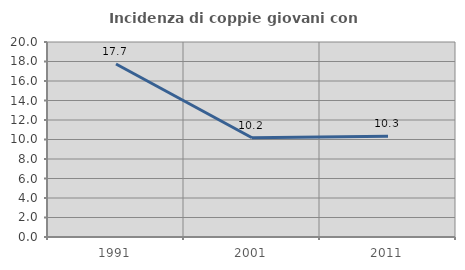
| Category | Incidenza di coppie giovani con figli |
|---|---|
| 1991.0 | 17.749 |
| 2001.0 | 10.174 |
| 2011.0 | 10.333 |